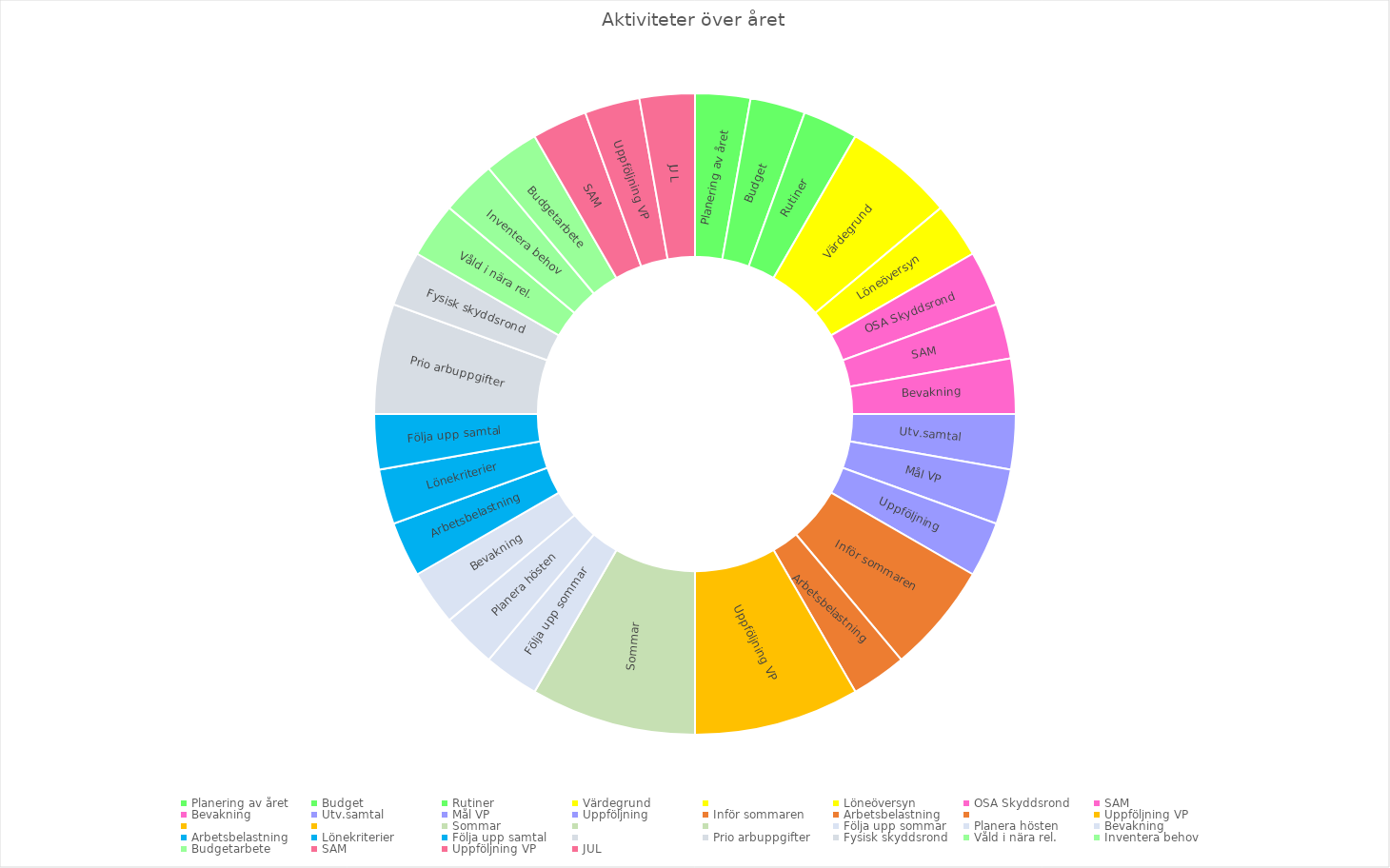
| Category | Series 0 |
|---|---|
| Planering av året | 1 |
| Budget | 1 |
| Rutiner | 1 |
| Värdegrund | 2 |
|  | 0 |
| Löneöversyn | 1 |
| OSA Skyddsrond | 1 |
| SAM | 1 |
| Bevakning | 1 |
| Utv.samtal | 1 |
| Mål VP | 1 |
| Uppföljning | 1 |
| Inför sommaren | 2 |
| Arbetsbelastning | 1 |
|  | 0 |
| Uppföljning VP | 3 |
|  | 0 |
|  | 0 |
| Sommar | 3 |
|  | 0 |
|  | 0 |
| Följa upp sommar | 1 |
| Planera hösten | 1 |
| Bevakning | 1 |
| Arbetsbelastning | 1 |
| Lönekriterier | 1 |
| Följa upp samtal | 1 |
|  | 0 |
| Prio arbuppgifter | 2 |
| Fysisk skyddsrond | 1 |
| Våld i nära rel. | 1 |
| Inventera behov | 1 |
| Budgetarbete | 1 |
| SAM | 1 |
| Uppföljning VP | 1 |
| JUL | 1 |